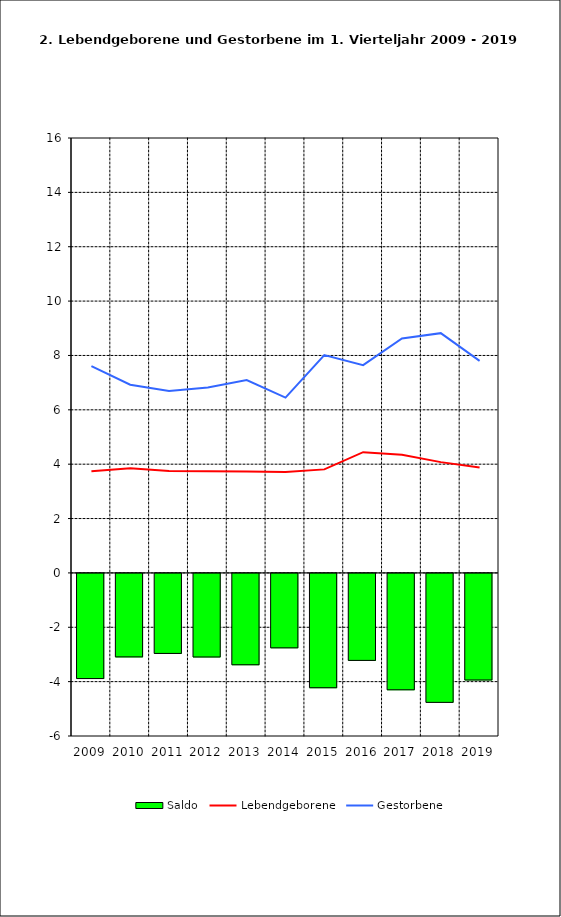
| Category | Saldo |
|---|---|
| 2009.0 | -3.869 |
| 2010.0 | -3.071 |
| 2011.0 | -2.944 |
| 2012.0 | -3.075 |
| 2013.0 | -3.361 |
| 2014.0 | -2.739 |
| 2015.0 | -4.206 |
| 2016.0 | -3.2 |
| 2017.0 | -4.282 |
| 2018.0 | -4.744 |
| 2019.0 | -3.921 |